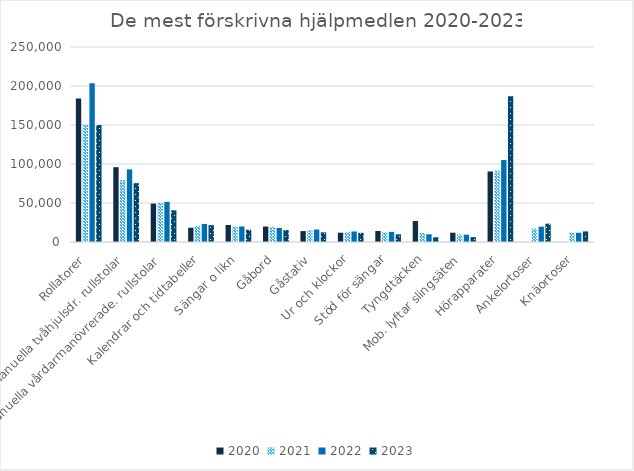
| Category | 2020 | 2021 | 2022 | 2023 |
|---|---|---|---|---|
| Rollatorer | 183828 | 150380 | 203629 | 149982 |
| Manuella tvåhjulsdr. rullstolar | 95912 | 79442 | 93060 | 75423 |
| Manuella vårdarmanövrerade. rullstolar | 49243 | 49973 | 51486 | 40620 |
| Kalendrar och tidtabeller | 18276 | 20606 | 23157 | 21562 |
| Sängar o likn | 21786 | 19565 | 19952 | 15656 |
| Gåbord | 19831 | 18859 | 17950 | 15360 |
| Gåstativ | 13988 | 14879 | 15998 | 12373 |
| Ur och klockor | 11893 | 12893 | 13539 | 11801 |
| Stöd för sängar | 14150 | 12543 | 12983 | 9855 |
| Tyngdtäcken | 26851 | 11380 | 9887 | 6013 |
| Mob. lyftar slingsäten | 11923 | 9615 | 9386 | 6267 |
| Hörapparater | 90496 | 91453 | 105070 | 186894 |
| Ankelortoser | 0 | 17291 | 19676 | 23502 |
| Knäortoser | 0 | 12470 | 11867 | 13572 |